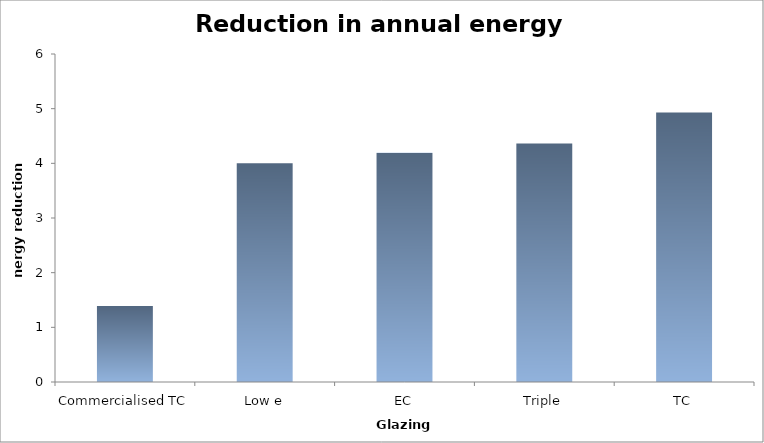
| Category | Series 0 |
|---|---|
| Commercialised TC | 1.391 |
| Low e | 4.003 |
| EC | 4.192 |
| Triple | 4.364 |
| TC | 4.932 |